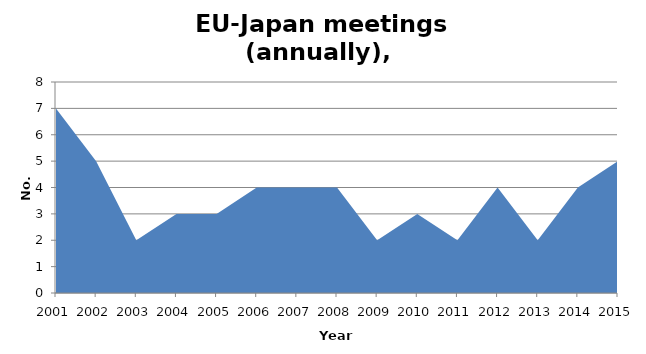
| Category | No. meetings |
|---|---|
| 2001.0 | 7 |
| 2002.0 | 5 |
| 2003.0 | 2 |
| 2004.0 | 3 |
| 2005.0 | 3 |
| 2006.0 | 4 |
| 2007.0 | 4 |
| 2008.0 | 4 |
| 2009.0 | 2 |
| 2010.0 | 3 |
| 2011.0 | 2 |
| 2012.0 | 4 |
| 2013.0 | 2 |
| 2014.0 | 4 |
| 2015.0 | 5 |